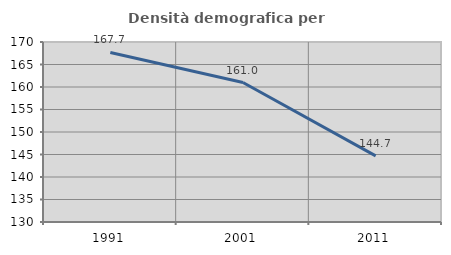
| Category | Densità demografica |
|---|---|
| 1991.0 | 167.673 |
| 2001.0 | 160.992 |
| 2011.0 | 144.708 |